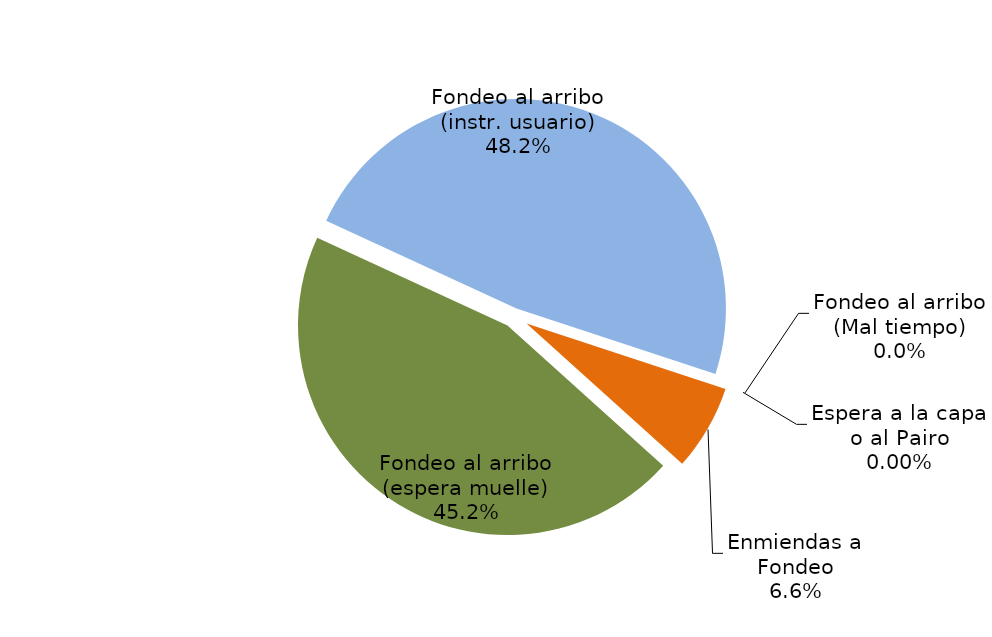
| Category | Series 0 |
|---|---|
| Fondeo al arribo (espera muelle) | 7967.687 |
| Fondeo al arribo (instr. usuario) | 8493.879 |
| Fondeo al arribo (Mal tiempo) | 0 |
| Espera a la capa o al Pairo | 0 |
| Enmiendas a Fondeo | 1165.02 |